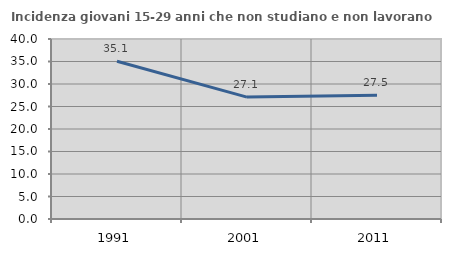
| Category | Incidenza giovani 15-29 anni che non studiano e non lavorano  |
|---|---|
| 1991.0 | 35.06 |
| 2001.0 | 27.092 |
| 2011.0 | 27.5 |